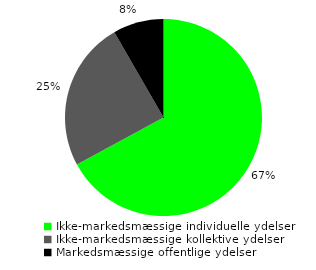
| Category | Series 0 |
|---|---|
| Ikke-markedsmæssige individuelle ydelser | 0.671 |
| Ikke-markedsmæssige kollektive ydelser | 0.246 |
| Markedsmæssige offentlige ydelser | 0.083 |